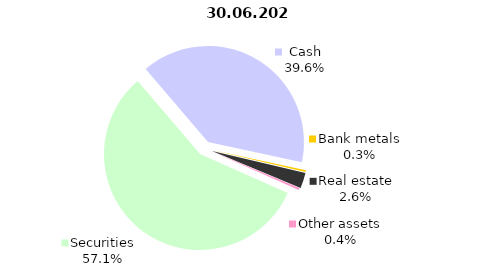
| Category | 30.06.2020 |
|---|---|
| Securities | 1925.449 |
| Cash | 1336.633 |
| Bank metals | 9.733 |
| Real estate | 88.274 |
| Other assets | 12.94 |